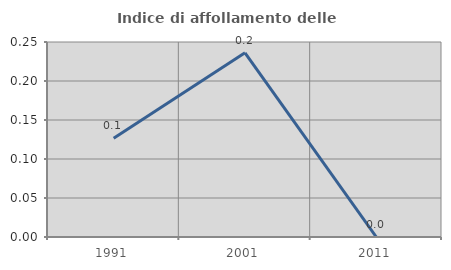
| Category | Indice di affollamento delle abitazioni  |
|---|---|
| 1991.0 | 0.127 |
| 2001.0 | 0.236 |
| 2011.0 | 0 |